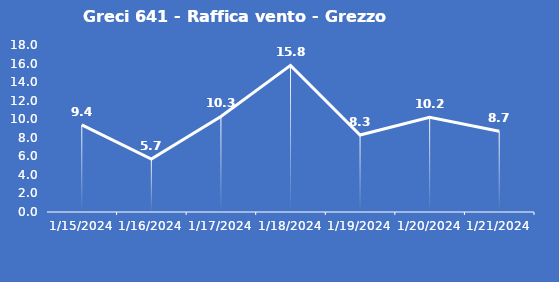
| Category | Greci 641 - Raffica vento - Grezzo (m/s) |
|---|---|
| 1/15/24 | 9.4 |
| 1/16/24 | 5.7 |
| 1/17/24 | 10.3 |
| 1/18/24 | 15.8 |
| 1/19/24 | 8.3 |
| 1/20/24 | 10.2 |
| 1/21/24 | 8.7 |